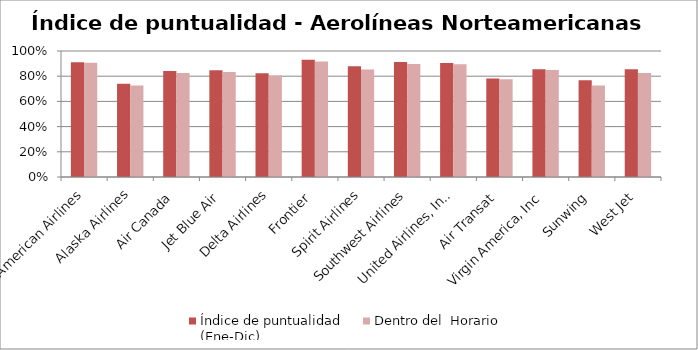
| Category | Índice de puntualidad
(Ene-Dic) | Dentro del  Horario |
|---|---|---|
| American Airlines | 0.912 | 0.907 |
| Alaska Airlines | 0.74 | 0.726 |
| Air Canada | 0.842 | 0.824 |
| Jet Blue Air | 0.847 | 0.833 |
| Delta Airlines | 0.824 | 0.806 |
| Frontier | 0.93 | 0.917 |
| Spirit Airlines | 0.88 | 0.854 |
| Southwest Airlines | 0.913 | 0.897 |
| United Airlines, Inc. | 0.905 | 0.895 |
| Air Transat | 0.781 | 0.775 |
| Virgin America, Inc | 0.855 | 0.848 |
| Sunwing | 0.768 | 0.726 |
| West Jet | 0.855 | 0.825 |